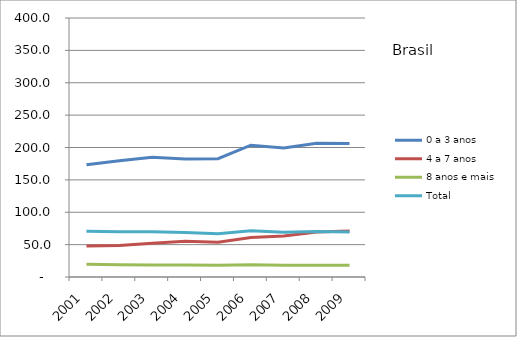
| Category | 0 a 3 anos | 4 a 7 anos | 8 anos e mais | Total |
|---|---|---|---|---|
| 2001.0 | 173.3 | 47.9 | 19.6 | 70.5 |
| 2002.0 | 179.7 | 48.6 | 19 | 69.9 |
| 2003.0 | 185 | 52.3 | 18.7 | 70 |
| 2004.0 | 182.2 | 55.1 | 18.6 | 68.9 |
| 2005.0 | 182.7 | 53.7 | 18.1 | 66.8 |
| 2006.0 | 203.5 | 60.9 | 19.1 | 71.5 |
| 2007.0 | 199.4 | 63.5 | 18.2 | 69.3 |
| 2008.0 | 206.7 | 69.5 | 18.1 | 70.4 |
| 2009.0 | 206.3 | 71.2 | 18.3 | 69.5 |